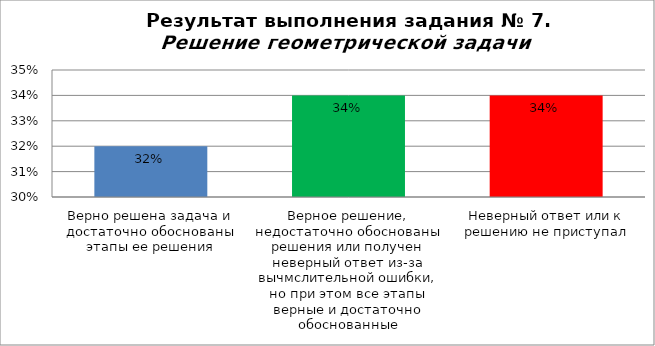
| Category | Решение геометрической задачи  |
|---|---|
| Верно решена задача и достаточно обоснованы этапы ее решения | 0.32 |
| Верное решение, недостаточно обоснованы решения или получен неверный ответ из-за вычмслительной ошибки, но при этом все этапы верные и достаточно обоснованные | 0.34 |
| Неверный ответ или к решению не приступал | 0.34 |